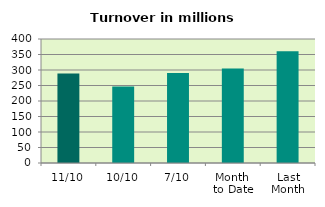
| Category | Series 0 |
|---|---|
| 11/10 | 288.953 |
| 10/10 | 246.522 |
| 7/10 | 290.671 |
| Month 
to Date | 305.2 |
| Last
Month | 360.198 |